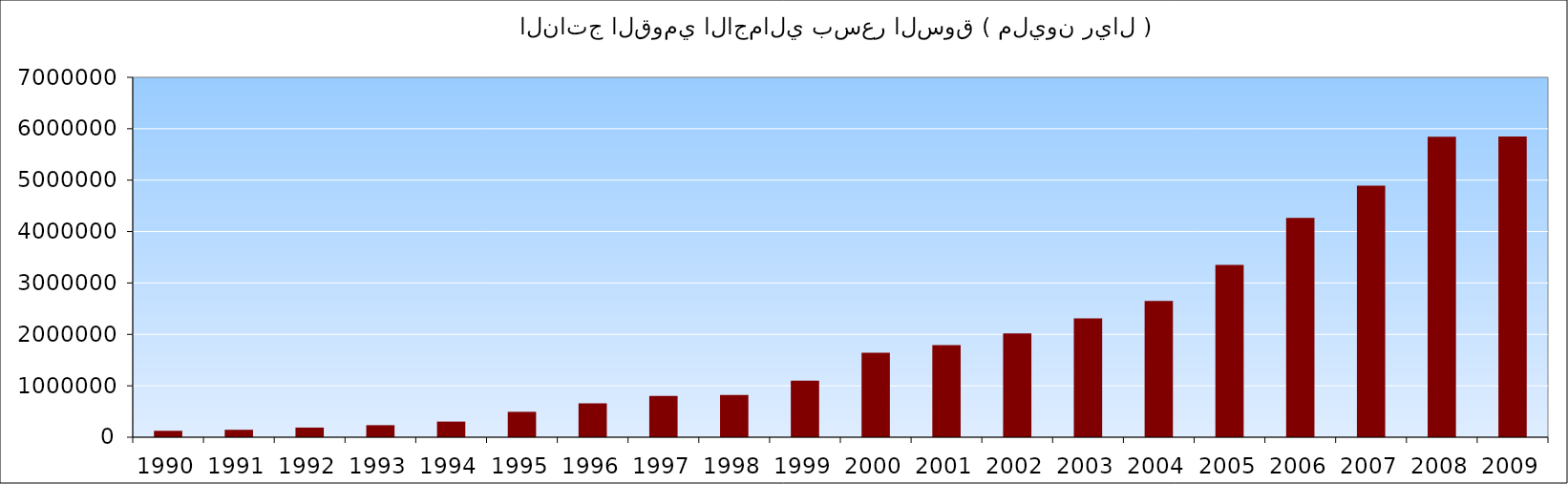
| Category | الناتج القومي الاجمالي بسعر السوق ( مليون ريال ) |
|---|---|
| 1990.0 | 124622 |
| 1991.0 | 144670 |
| 1992.0 | 187413 |
| 1993.0 | 234153 |
| 1994.0 | 304213 |
| 1995.0 | 494108 |
| 1996.0 | 661187 |
| 1997.0 | 801187 |
| 1998.0 | 820394 |
| 1999.0 | 1098532 |
| 2000.0 | 1642601.994 |
| 2001.0 | 1790171.763 |
| 2002.0 | 2018965.871 |
| 2003.0 | 2311023.143 |
| 2004.0 | 2650049.021 |
| 2005.0 | 3351002.255 |
| 2006.0 | 4265586.45 |
| 2007.0 | 4890496.511 |
| 2008.0 | 5842062.957 |
| 2009.0 | 5850365.423 |